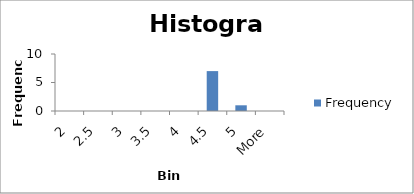
| Category | Frequency |
|---|---|
| 2 | 0 |
| 2.5 | 0 |
| 3 | 0 |
| 3.5 | 0 |
| 4 | 0 |
| 4.5 | 7 |
| 5 | 1 |
| More | 0 |